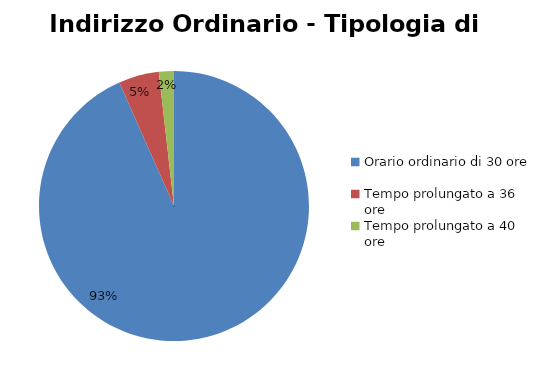
| Category | Series 0 |
|---|---|
| Orario ordinario di 30 ore | 34836 |
| Tempo prolungato a 36 ore | 1805 |
| Tempo prolungato a 40 ore | 672 |